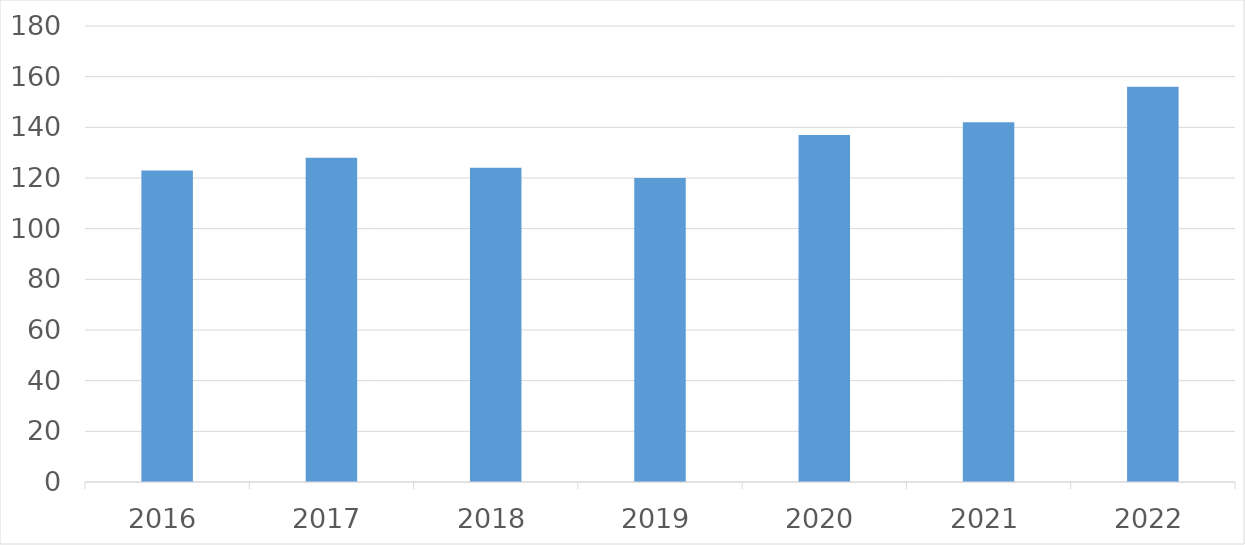
| Category | Series 0 |
|---|---|
| 2016 | 123 |
| 2017 | 128 |
| 2018 | 124 |
| 2019 | 120 |
| 2020 | 137 |
| 2021 | 142 |
| 2022 | 156 |